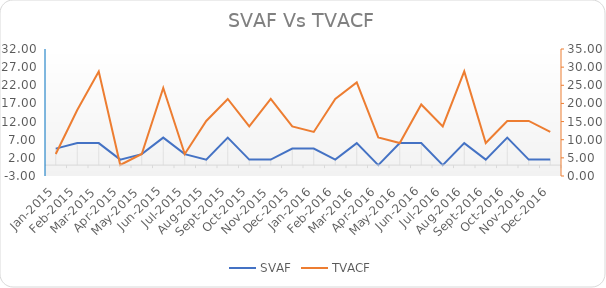
| Category | SVAF |
|---|---|
| 2015-01-01 | 4.551 |
| 2015-02-01 | 6.068 |
| 2015-03-01 | 6.068 |
| 2015-04-01 | 1.517 |
| 2015-05-01 | 3.034 |
| 2015-06-01 | 7.585 |
| 2015-07-01 | 3.034 |
| 2015-08-01 | 1.517 |
| 2015-09-01 | 7.585 |
| 2015-10-01 | 1.517 |
| 2015-11-01 | 1.517 |
| 2015-12-01 | 4.551 |
| 2016-01-01 | 4.551 |
| 2016-02-01 | 1.517 |
| 2016-03-01 | 6.068 |
| 2016-04-01 | 0 |
| 2016-05-01 | 6.068 |
| 2016-06-01 | 6.068 |
| 2016-07-01 | 0 |
| 2016-08-01 | 6.068 |
| 2016-09-01 | 1.517 |
| 2016-10-01 | 7.585 |
| 2016-11-01 | 1.517 |
| 2016-12-01 | 1.517 |